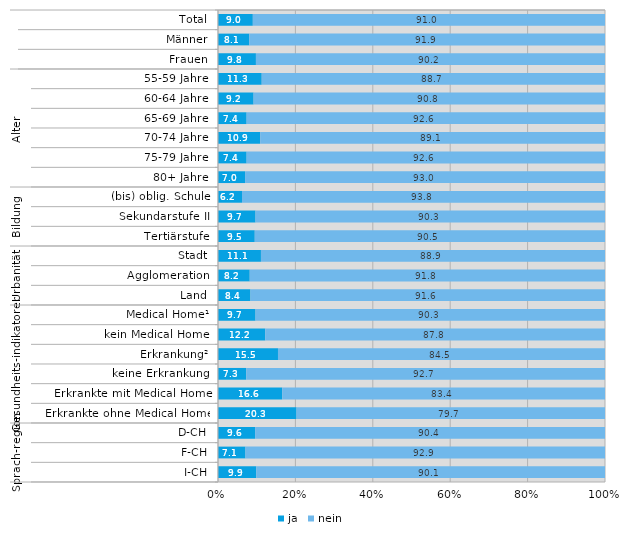
| Category | ja | nein |
|---|---|---|
| 0 | 9 | 91 |
| 1 | 8.1 | 91.9 |
| 2 | 9.8 | 90.2 |
| 3 | 11.3 | 88.7 |
| 4 | 9.2 | 90.8 |
| 5 | 7.4 | 92.6 |
| 6 | 10.9 | 89.1 |
| 7 | 7.4 | 92.6 |
| 8 | 7 | 93 |
| 9 | 6.2 | 93.8 |
| 10 | 9.7 | 90.3 |
| 11 | 9.5 | 90.5 |
| 12 | 11.1 | 88.9 |
| 13 | 8.2 | 91.8 |
| 14 | 8.4 | 91.6 |
| 15 | 9.7 | 90.3 |
| 16 | 12.2 | 87.8 |
| 17 | 15.5 | 84.5 |
| 18 | 7.3 | 92.7 |
| 19 | 16.6 | 83.4 |
| 20 | 20.3 | 79.7 |
| 21 | 9.6 | 90.4 |
| 22 | 7.1 | 92.9 |
| 23 | 9.9 | 90.1 |